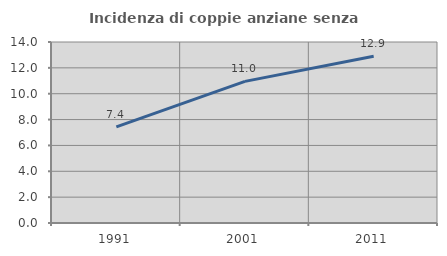
| Category | Incidenza di coppie anziane senza figli  |
|---|---|
| 1991.0 | 7.438 |
| 2001.0 | 10.954 |
| 2011.0 | 12.892 |